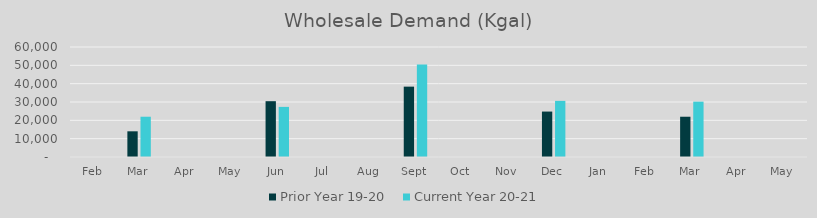
| Category | Prior Year 19-20  | Current Year 20-21 |
|---|---|---|
| Feb | 0 | 0 |
| Mar | 14013.78 | 21965.02 |
| Apr | 0 | 0 |
| May | 0 | 0 |
| Jun | 30443.6 | 27331 |
| Jul | 0 | 0 |
| Aug | 0 | 0 |
| Sep | 38376.14 | 50400.24 |
| Oct | 0 | 0 |
| Nov | 0 | 0 |
| Dec | 24784.98 | 30611.9 |
| Jan | 0 | 0 |
| Feb | 0 | 0 |
| Mar | 21965.02 | 30196.76 |
| Apr | 0 | 0 |
| May | 0 | 0 |